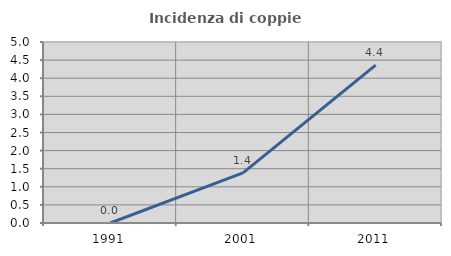
| Category | Incidenza di coppie miste |
|---|---|
| 1991.0 | 0 |
| 2001.0 | 1.384 |
| 2011.0 | 4.361 |